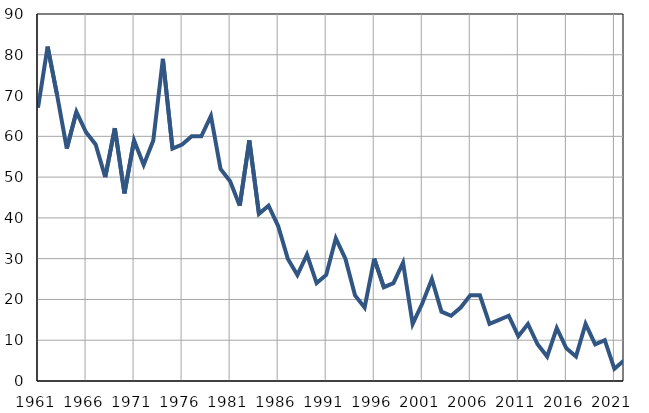
| Category | Infants
deaths |
|---|---|
| 1961.0 | 67 |
| 1962.0 | 82 |
| 1963.0 | 70 |
| 1964.0 | 57 |
| 1965.0 | 66 |
| 1966.0 | 61 |
| 1967.0 | 58 |
| 1968.0 | 50 |
| 1969.0 | 62 |
| 1970.0 | 46 |
| 1971.0 | 59 |
| 1972.0 | 53 |
| 1973.0 | 59 |
| 1974.0 | 79 |
| 1975.0 | 57 |
| 1976.0 | 58 |
| 1977.0 | 60 |
| 1978.0 | 60 |
| 1979.0 | 65 |
| 1980.0 | 52 |
| 1981.0 | 49 |
| 1982.0 | 43 |
| 1983.0 | 59 |
| 1984.0 | 41 |
| 1985.0 | 43 |
| 1986.0 | 38 |
| 1987.0 | 30 |
| 1988.0 | 26 |
| 1989.0 | 31 |
| 1990.0 | 24 |
| 1991.0 | 26 |
| 1992.0 | 35 |
| 1993.0 | 30 |
| 1994.0 | 21 |
| 1995.0 | 18 |
| 1996.0 | 30 |
| 1997.0 | 23 |
| 1998.0 | 24 |
| 1999.0 | 29 |
| 2000.0 | 14 |
| 2001.0 | 19 |
| 2002.0 | 25 |
| 2003.0 | 17 |
| 2004.0 | 16 |
| 2005.0 | 18 |
| 2006.0 | 21 |
| 2007.0 | 21 |
| 2008.0 | 14 |
| 2009.0 | 15 |
| 2010.0 | 16 |
| 2011.0 | 11 |
| 2012.0 | 14 |
| 2013.0 | 9 |
| 2014.0 | 6 |
| 2015.0 | 13 |
| 2016.0 | 8 |
| 2017.0 | 6 |
| 2018.0 | 14 |
| 2019.0 | 9 |
| 2020.0 | 10 |
| 2021.0 | 3 |
| 2022.0 | 5 |